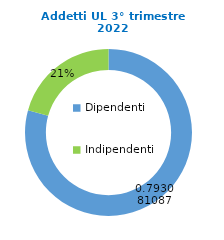
| Category | Series 0 |
|---|---|
| Dipendenti | 84387 |
| Indipendenti | 22017 |